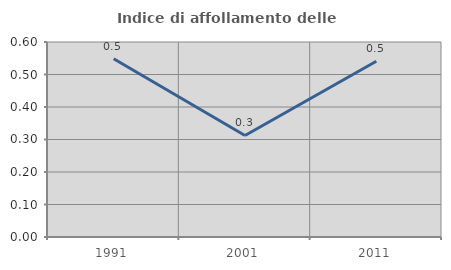
| Category | Indice di affollamento delle abitazioni  |
|---|---|
| 1991.0 | 0.548 |
| 2001.0 | 0.312 |
| 2011.0 | 0.541 |